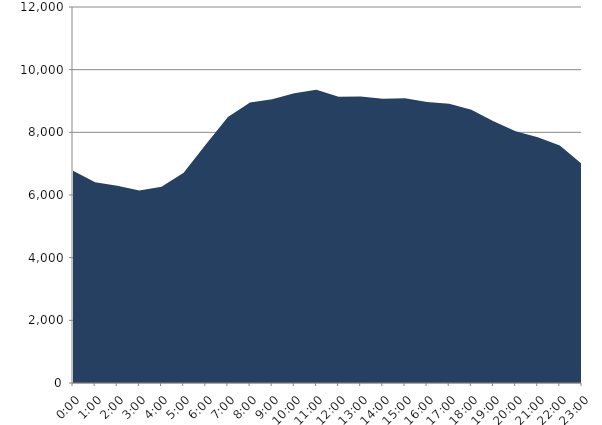
| Category | Series 0 | Series 1 |
|---|---|---|
| 2017-07-19 |  | 6773.3 |
| 2017-07-19 01:00:00 |  | 6410.86 |
| 2017-07-19 02:00:00 |  | 6293.77 |
| 2017-07-19 03:00:00 |  | 6145.15 |
| 2017-07-19 04:00:00 |  | 6260.13 |
| 2017-07-19 05:00:00 |  | 6712.94 |
| 2017-07-19 06:00:00 |  | 7611.86 |
| 2017-07-19 07:00:00 |  | 8489.97 |
| 2017-07-19 08:00:00 |  | 8952.6 |
| 2017-07-19 09:00:00 |  | 9052.6 |
| 2017-07-19 10:00:00 |  | 9249.65 |
| 2017-07-19 11:00:00 |  | 9361.18 |
| 2017-07-19 12:00:00 |  | 9139.6 |
| 2017-07-19 13:00:00 |  | 9142.33 |
| 2017-07-19 14:00:00 |  | 9069.59 |
| 2017-07-19 15:00:00 |  | 9087.13 |
| 2017-07-19 16:00:00 |  | 8965.33 |
| 2017-07-19 17:00:00 |  | 8911.41 |
| 2017-07-19 18:00:00 |  | 8721.43 |
| 2017-07-19 19:00:00 |  | 8350.05 |
| 2017-07-19 20:00:00 |  | 8033.31 |
| 2017-07-19 21:00:00 |  | 7841.76 |
| 2017-07-19 22:00:00 |  | 7583.2 |
| 2017-07-19 23:00:00 |  | 6983.53 |